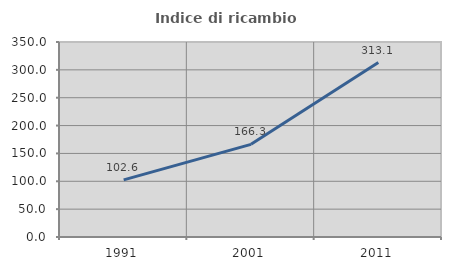
| Category | Indice di ricambio occupazionale  |
|---|---|
| 1991.0 | 102.602 |
| 2001.0 | 166.279 |
| 2011.0 | 313.115 |